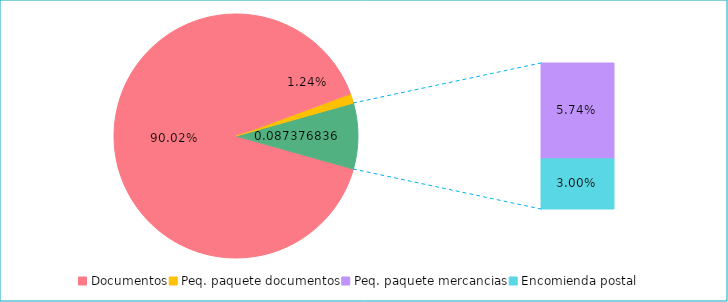
| Category | Series 0 |
|---|---|
| Documentos | 0.9 |
| Peq. paquete documentos | 0.012 |
| Peq. paquete mercancias | 0.057 |
| Encomienda postal | 0.03 |